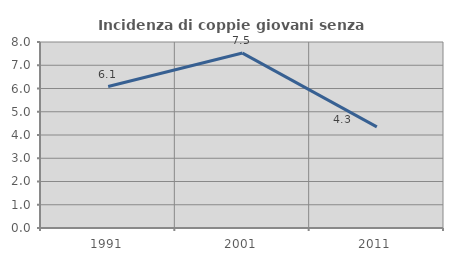
| Category | Incidenza di coppie giovani senza figli |
|---|---|
| 1991.0 | 6.083 |
| 2001.0 | 7.524 |
| 2011.0 | 4.348 |